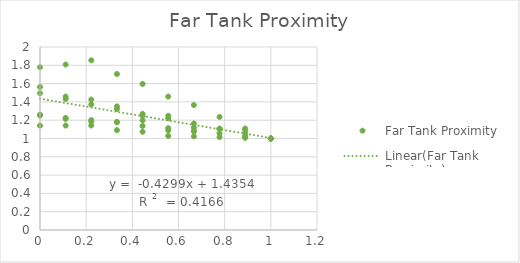
| Category | Far Tank Proximity |
|---|---|
| 1.0 | 1 |
| 0.8888888888888888 | 1.008 |
| 0.7777777777777778 | 1.016 |
| 0.6666666666666666 | 1.023 |
| 0.5555555555555556 | 1.028 |
| 0.4444444444444444 | 1.073 |
| 0.3333333333333333 | 1.092 |
| 0.2222222222222222 | 1.142 |
| 0.1111111111111111 | 1.142 |
| 0.0 | 1.141 |
| 1.0 | 1 |
| 0.8888888888888888 | 1.109 |
| 0.7777777777777778 | 1.236 |
| 0.6666666666666666 | 1.366 |
| 0.5555555555555556 | 1.458 |
| 0.4444444444444444 | 1.596 |
| 0.3333333333333333 | 1.705 |
| 0.2222222222222222 | 1.855 |
| 0.1111111111111111 | 1.808 |
| 0.0 | 1.779 |
| 1.0 | 1 |
| 0.888888888888889 | 1.058 |
| 0.7777777777777779 | 1.106 |
| 0.6666666666666667 | 1.164 |
| 0.5555555555555557 | 1.22 |
| 0.44444444444444464 | 1.269 |
| 0.33333333333333354 | 1.323 |
| 0.22222222222222238 | 1.372 |
| 0.11111111111111119 | 1.432 |
| 0.0 | 1.495 |
| 1.0 | 1 |
| 0.8888889411764708 | 1.022 |
| 0.7777778823529415 | 1.107 |
| 0.6666668235294123 | 1.075 |
| 0.555555764705883 | 1.088 |
| 0.44444470588235374 | 1.197 |
| 0.3333336470588245 | 1.181 |
| 0.22222258823529528 | 1.184 |
| 0.11111152941176602 | 1.213 |
| 0.0 | 1.261 |
| 1.0 | 1 |
| 0.8888888888888888 | 1.089 |
| 0.7777777777777778 | 1.105 |
| 0.6666666666666666 | 1.123 |
| 0.5555555555555556 | 1.249 |
| 0.4444444444444444 | 1.247 |
| 0.3333333333333333 | 1.351 |
| 0.2222222222222222 | 1.425 |
| 0.1111111111111111 | 1.458 |
| 0.0 | 1.564 |
| 1.0 | 1 |
| 0.8888892831795598 | 1.024 |
| 0.7777785663591198 | 1.056 |
| 0.6666678495386796 | 1.089 |
| 0.5555571327182395 | 1.113 |
| 0.4444464158977994 | 1.137 |
| 0.3333356990773592 | 1.177 |
| 0.2222249822569191 | 1.202 |
| 0.11111426543647898 | 1.226 |
| 0.0 | 1.25 |